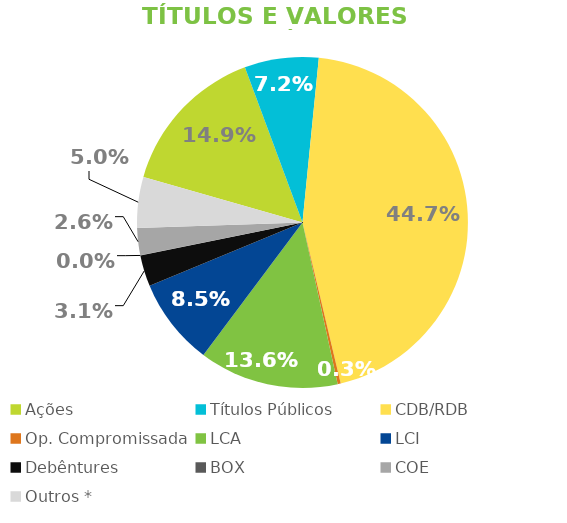
| Category | TVM |
|---|---|
| Ações | 0.149 |
| Títulos Públicos | 0.072 |
| CDB/RDB | 0.447 |
| Op. Compromissada | 0.003 |
| LCA | 0.136 |
| LCI | 0.085 |
| Debêntures | 0.031 |
| BOX | 0 |
| COE | 0.026 |
| Outros * | 0.05 |